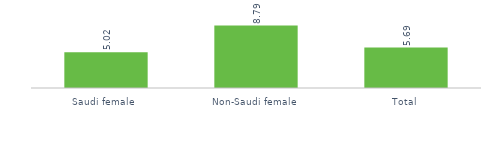
| Category | before age 18 years |
|---|---|
| Saudi female  | 5.024 |
| Non-Saudi female | 8.788 |
| Total | 5.69 |